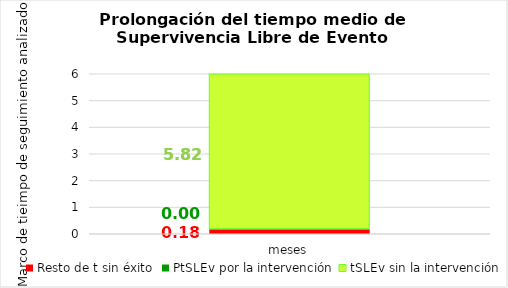
| Category | Resto de t sin éxito | PtSLEv por la intervención | tSLEv sin la intervención |
|---|---|---|---|
| meses | 0.181 | 0 | 5.819 |